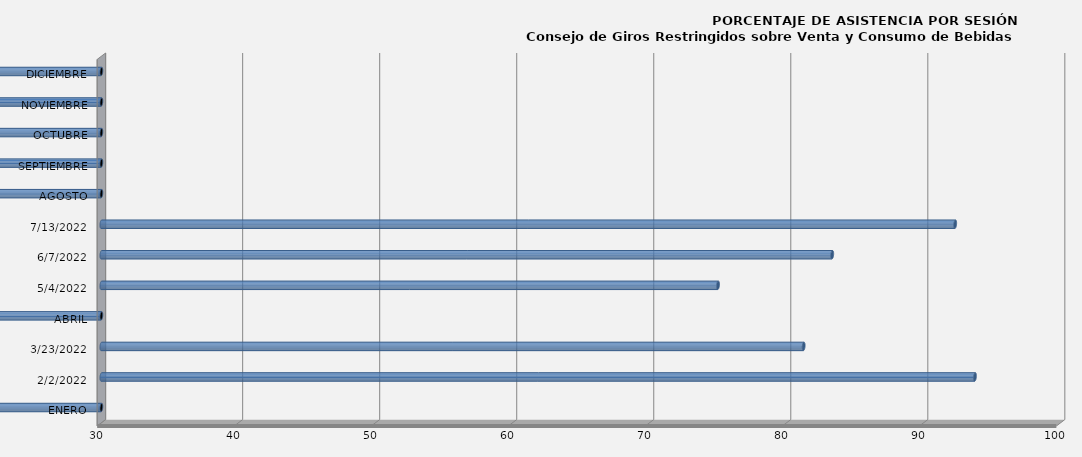
| Category | Series 0 |
|---|---|
| ENERO | 0 |
| 02/02/2022 | 93.75 |
| 23/03/2022 | 81.25 |
| ABRIL | 0 |
| 04/05/2022 | 75 |
| 07/06/2022 | 83.333 |
| 13/07/2022 | 92.308 |
| AGOSTO | 0 |
| SEPTIEMBRE | 0 |
| OCTUBRE | 0 |
| NOVIEMBRE | 0 |
| DICIEMBRE | 0 |